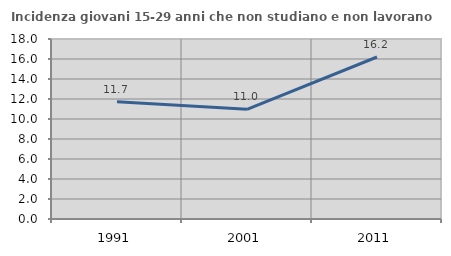
| Category | Incidenza giovani 15-29 anni che non studiano e non lavorano  |
|---|---|
| 1991.0 | 11.733 |
| 2001.0 | 10.973 |
| 2011.0 | 16.201 |